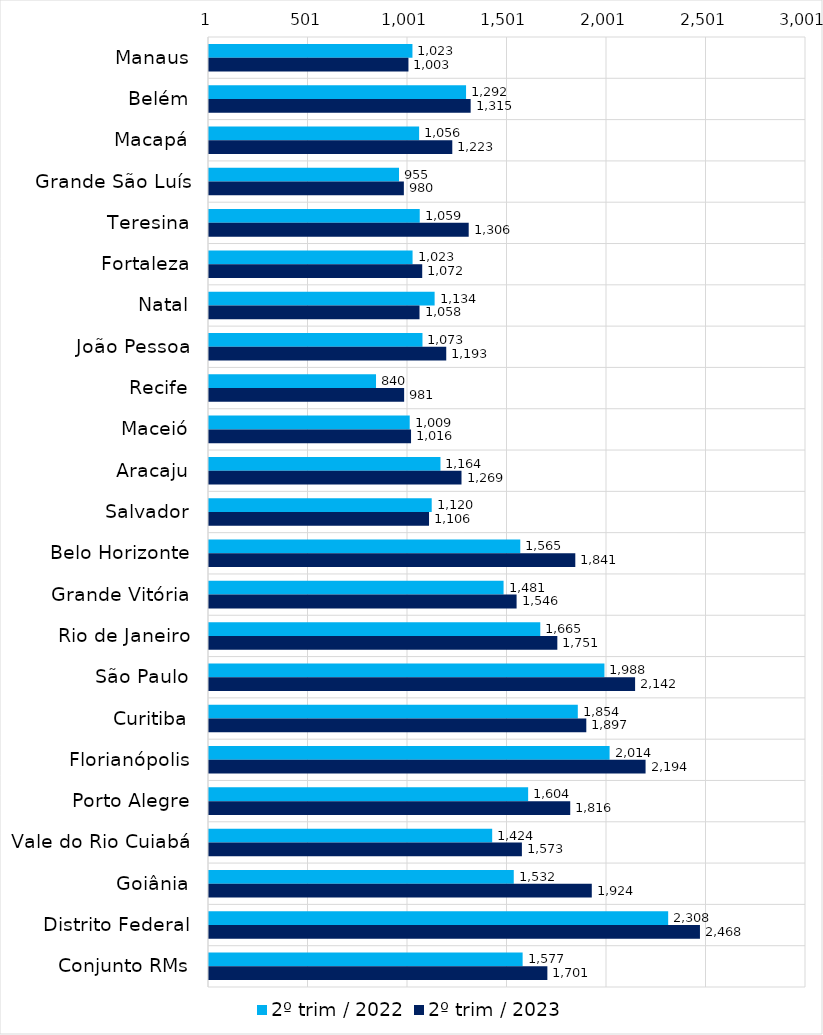
| Category | 2º trim / 2022 | 2º trim / 2023 |
|---|---|---|
| Manaus | 1022.874 | 1002.749 |
| Belém | 1292.277 | 1315.39 |
| Macapá | 1056.398 | 1223.077 |
| Grande São Luís | 955.338 | 979.716 |
| Teresina | 1059.486 | 1305.526 |
| Fortaleza | 1023.479 | 1071.951 |
| Natal | 1134.26 | 1058.356 |
| João Pessoa | 1073.253 | 1192.703 |
| Recife | 839.807 | 981.115 |
| Maceió | 1009.073 | 1015.785 |
| Aracaju | 1163.651 | 1269.345 |
| Salvador | 1119.642 | 1106.206 |
| Belo Horizonte | 1564.742 | 1841.208 |
| Grande Vitória | 1480.716 | 1546.208 |
| Rio de Janeiro | 1665.244 | 1750.911 |
| São Paulo | 1987.62 | 2141.729 |
| Curitiba | 1853.772 | 1896.508 |
| Florianópolis | 2013.507 | 2194.305 |
| Porto Alegre | 1604.229 | 1815.73 |
| Vale do Rio Cuiabá | 1423.519 | 1572.849 |
| Goiânia | 1531.978 | 1924.053 |
| Distrito Federal | 2307.9 | 2467.598 |
| Conjunto RMs | 1576.537 | 1700.855 |